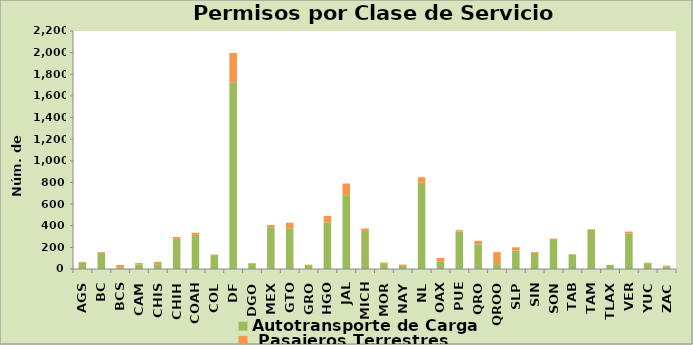
| Category | Autotransporte de Carga  |  Pasajeros Terrestres |
|---|---|---|
| AGS | 58 | 8 |
| BC | 147 | 9 |
| BCS | 14 | 23 |
| CAM | 43 | 12 |
| CHIS | 45 | 21 |
| CHIH | 279 | 17 |
| COAH | 315 | 20 |
| COL | 128 | 6 |
| DF | 1726 | 271 |
| DGO | 53 | 1 |
| MEX | 386 | 21 |
| GTO | 377 | 51 |
| GRO | 28 | 12 |
| HGO | 432 | 60 |
| JAL | 682 | 108 |
| MICH | 351 | 23 |
| MOR | 48 | 13 |
| NAY | 28 | 13 |
| NL | 799 | 49 |
| OAX | 68 | 34 |
| PUE | 346 | 13 |
| QRO | 226 | 34 |
| QROO | 45 | 111 |
| SLP | 169 | 31 |
| SIN | 148 | 8 |
| SON | 269 | 12 |
| TAB | 134 | 3 |
| TAM | 365 | 5 |
| TLAX | 37 | 1 |
| VER | 328 | 18 |
| YUC | 47 | 11 |
| ZAC | 24 | 8 |